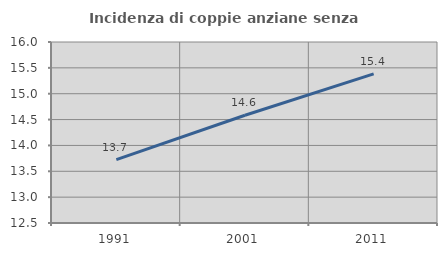
| Category | Incidenza di coppie anziane senza figli  |
|---|---|
| 1991.0 | 13.725 |
| 2001.0 | 14.583 |
| 2011.0 | 15.385 |